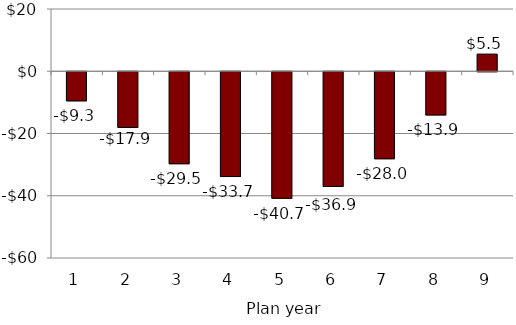
| Category | Series 0 |
|---|---|
| 1.0 | -9346156.14 |
| 2.0 | -17872029.314 |
| 3.0 | -29545999.935 |
| 4.0 | -33672439.798 |
| 5.0 | -40662019.512 |
| 6.0 | -36854677.161 |
| 7.0 | -27952805.178 |
| 8.0 | -13864291.331 |
| 9.0 | 5508230.936 |